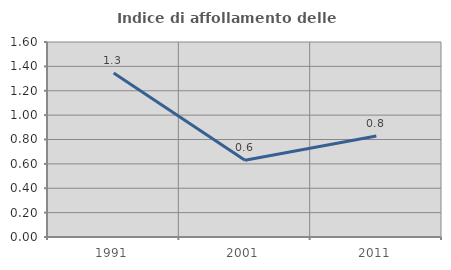
| Category | Indice di affollamento delle abitazioni  |
|---|---|
| 1991.0 | 1.345 |
| 2001.0 | 0.63 |
| 2011.0 | 0.828 |